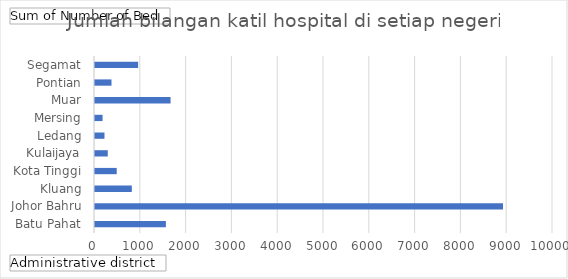
| Category | Total |
|---|---|
| Batu Pahat | 1548 |
| Johor Bahru | 8909 |
| Kluang | 804 |
| Kota Tinggi | 474 |
| Kulaijaya | 279 |
| Ledang | 207 |
| Mersing | 165 |
| Muar | 1650 |
| Pontian | 360 |
| Segamat | 942 |